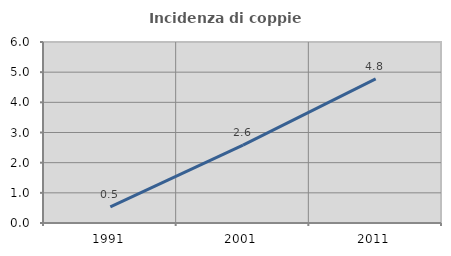
| Category | Incidenza di coppie miste |
|---|---|
| 1991.0 | 0.531 |
| 2001.0 | 2.582 |
| 2011.0 | 4.779 |